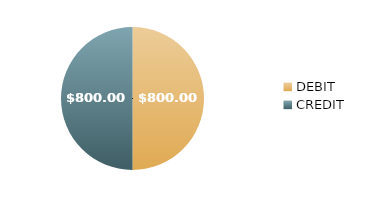
| Category | $800.00 |
|---|---|
| DEBIT | 800 |
| CREDIT | 800 |